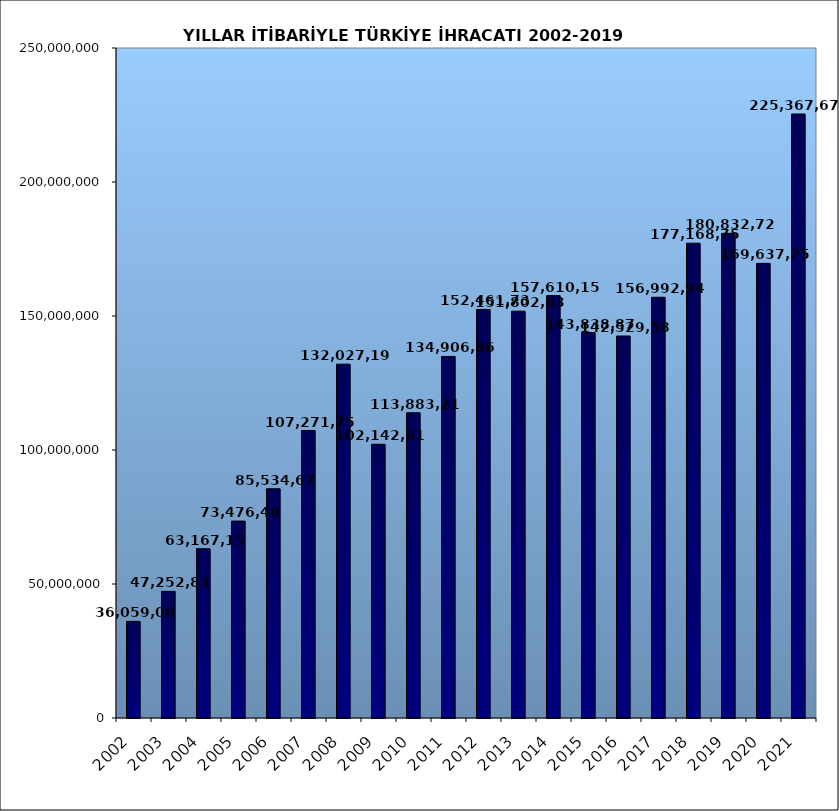
| Category | 2002 |
|---|---|
| 2002.0 | 36059089.029 |
| 2003.0 | 47252836.302 |
| 2004.0 | 63167152.82 |
| 2005.0 | 73476408.143 |
| 2006.0 | 85534675.518 |
| 2007.0 | 107271749.904 |
| 2008.0 | 132027195.626 |
| 2009.0 | 102142612.603 |
| 2010.0 | 113883219.184 |
| 2011.0 | 134906868.83 |
| 2012.0 | 152461736.556 |
| 2013.0 | 151802637.087 |
| 2014.0 | 157610157.69 |
| 2015.0 | 143838871.428 |
| 2016.0 | 142529583.808 |
| 2017.0 | 156992940.414 |
| 2018.0 | 177168756.288 |
| 2019.0 | 180832721.702 |
| 2020.0 | 169637755.31 |
| 2021.0 | 225367676.124 |